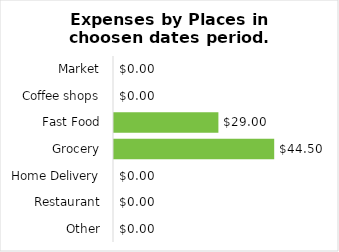
| Category | Expenses |
|---|---|
| Market | 0 |
| Coffee shops | 0 |
| Fast Food | 29 |
| Grocery | 44.5 |
| Home Delivery | 0 |
| Restaurant | 0 |
| Other | 0 |